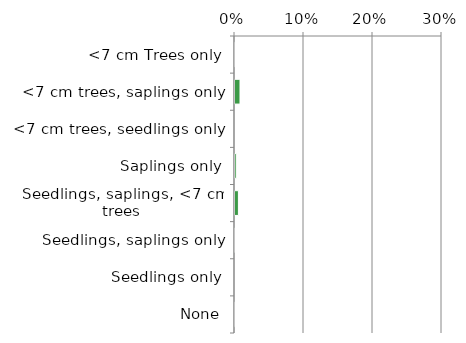
| Category | Near native & fragments |
|---|---|
| None | 0.001 |
| Seedlings only | 0 |
| Seedlings, saplings only | 0.001 |
| Seedlings, saplings, <7 cm trees | 0.006 |
| Saplings only | 0.003 |
| <7 cm trees, seedlings only | 0 |
| <7 cm trees, saplings only | 0.009 |
| <7 cm Trees only | 0.001 |